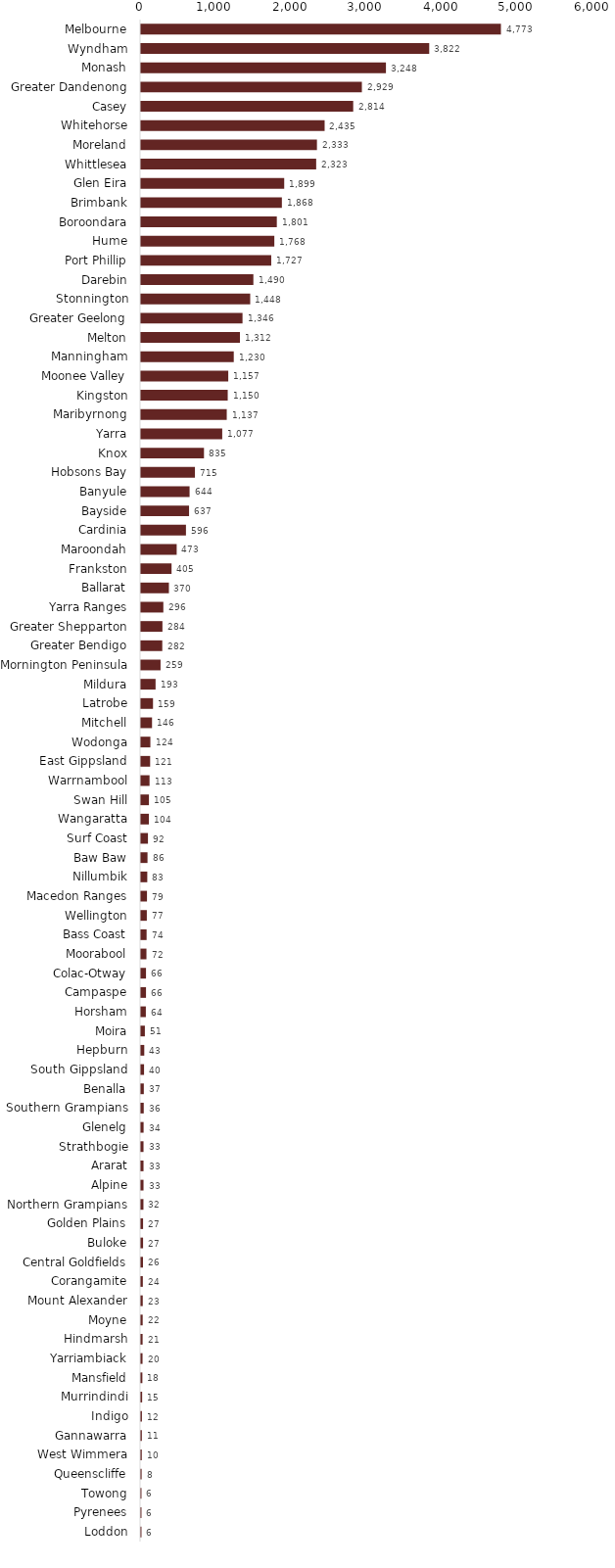
| Category | Series 0 |
|---|---|
| Melbourne | 4773 |
| Wyndham | 3822 |
| Monash | 3248 |
| Greater Dandenong | 2929 |
| Casey | 2814 |
| Whitehorse | 2435 |
| Moreland | 2333 |
| Whittlesea | 2323 |
| Glen Eira | 1899 |
| Brimbank | 1868 |
| Boroondara | 1801 |
| Hume | 1768 |
| Port Phillip | 1727 |
| Darebin | 1490 |
| Stonnington | 1448 |
| Greater Geelong | 1346 |
| Melton | 1312 |
| Manningham | 1230 |
| Moonee Valley | 1157 |
| Kingston | 1150 |
| Maribyrnong | 1137 |
| Yarra | 1077 |
| Knox | 835 |
| Hobsons Bay | 715 |
| Banyule | 644 |
| Bayside | 637 |
| Cardinia | 596 |
| Maroondah | 473 |
| Frankston | 405 |
| Ballarat | 370 |
| Yarra Ranges | 296 |
| Greater Shepparton | 284 |
| Greater Bendigo | 282 |
| Mornington Peninsula | 259 |
| Mildura | 193 |
| Latrobe | 159 |
| Mitchell | 146 |
| Wodonga | 124 |
| East Gippsland | 121 |
| Warrnambool | 113 |
| Swan Hill | 105 |
| Wangaratta | 104 |
| Surf Coast | 92 |
| Baw Baw | 86 |
| Nillumbik | 83 |
| Macedon Ranges | 79 |
| Wellington | 77 |
| Bass Coast | 74 |
| Moorabool | 72 |
| Colac-Otway | 66 |
| Campaspe | 66 |
| Horsham | 64 |
| Moira | 51 |
| Hepburn | 43 |
| South Gippsland | 40 |
| Benalla | 37 |
| Southern Grampians | 36 |
| Glenelg | 34 |
| Strathbogie | 33 |
| Ararat | 33 |
| Alpine | 33 |
| Northern Grampians | 32 |
| Golden Plains | 27 |
| Buloke | 27 |
| Central Goldfields | 26 |
| Corangamite | 24 |
| Mount Alexander | 23 |
| Moyne | 22 |
| Hindmarsh | 21 |
| Yarriambiack | 20 |
| Mansfield | 18 |
| Murrindindi | 15 |
| Indigo | 12 |
| Gannawarra | 11 |
| West Wimmera | 10 |
| Queenscliffe | 8 |
| Towong | 6 |
| Pyrenees | 6 |
| Loddon | 6 |